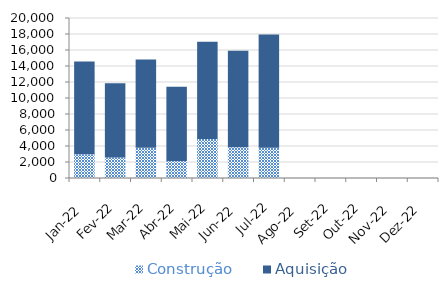
| Category | Construção | Aquisição  |
|---|---|---|
| Jan-22 | 2956.438 | 11598.93 |
| Fev-22 | 2568.19 | 9260.524 |
| Mar-22 | 3770.358 | 11052.944 |
| Abr-22 | 2115.17 | 9299.957 |
| Mai-22 | 4882.226 | 12149.951 |
| Jun-22 | 3857.194 | 12057.262 |
| Jul-22 | 3793.927 | 14149.755 |
| Ago-22 | 0 | 0 |
| Set-22 | 0 | 0 |
| Out-22 | 0 | 0 |
| Nov-22 | 0 | 0 |
| Dez-22 | 0 | 0 |